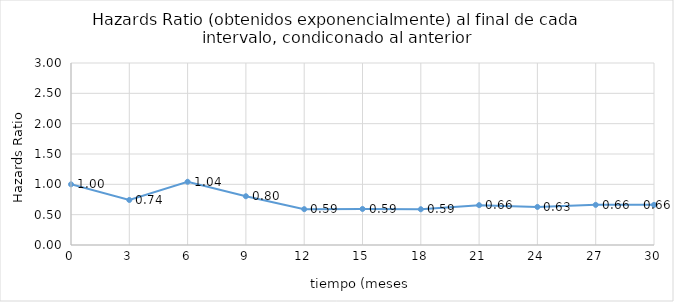
| Category | Series 0 |
|---|---|
| 0.0 | 1 |
| 3.0 | 0.742 |
| 6.0 | 1.042 |
| 9.0 | 0.804 |
| 12.0 | 0.591 |
| 15.0 | 0.594 |
| 18.0 | 0.589 |
| 21.0 | 0.657 |
| 24.0 | 0.628 |
| 27.0 | 0.662 |
| 30.0 | 0.662 |